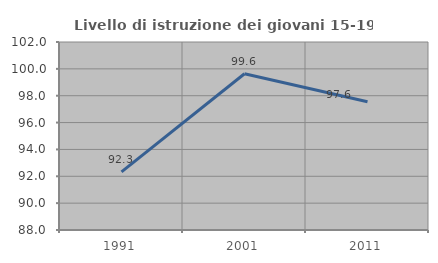
| Category | Livello di istruzione dei giovani 15-19 anni |
|---|---|
| 1991.0 | 92.327 |
| 2001.0 | 99.639 |
| 2011.0 | 97.551 |